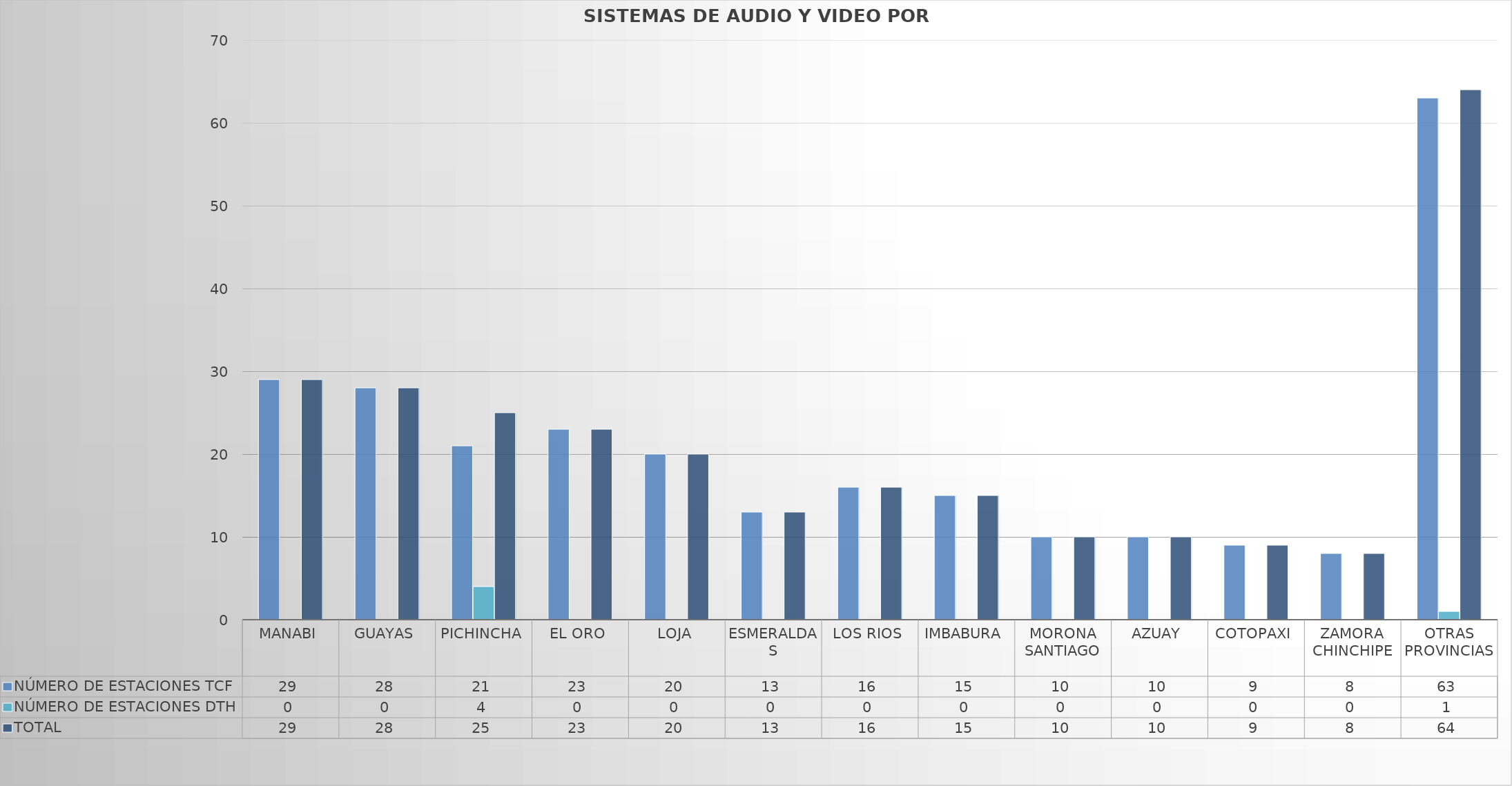
| Category | NÚMERO DE ESTACIONES TCF | NÚMERO DE ESTACIONES DTH | TOTAL |
|---|---|---|---|
| MANABI | 29 | 0 | 29 |
| GUAYAS | 28 | 0 | 28 |
| PICHINCHA | 21 | 4 | 25 |
| EL ORO | 23 | 0 | 23 |
| LOJA | 20 | 0 | 20 |
| ESMERALDAS | 13 | 0 | 13 |
| LOS RIOS | 16 | 0 | 16 |
| IMBABURA | 15 | 0 | 15 |
| MORONA SANTIAGO | 10 | 0 | 10 |
| AZUAY | 10 | 0 | 10 |
| COTOPAXI | 9 | 0 | 9 |
| ZAMORA CHINCHIPE | 8 | 0 | 8 |
| OTRAS PROVINCIAS | 63 | 1 | 64 |